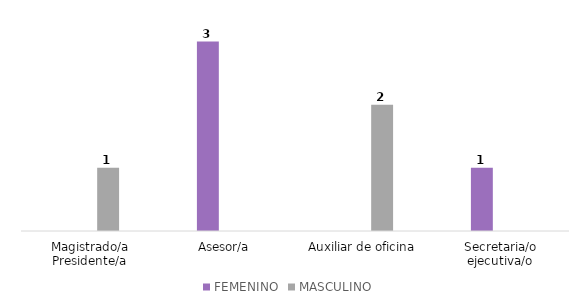
| Category | FEMENINO | MASCULINO |
|---|---|---|
| Magistrado/a Presidente/a | 0 | 1 |
| Asesor/a | 3 | 0 |
| Auxiliar de oficina | 0 | 2 |
| Secretaria/o ejecutiva/o | 1 | 0 |